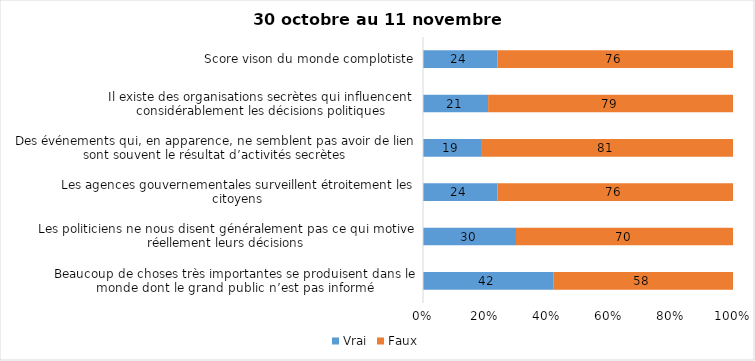
| Category | Vrai | Faux |
|---|---|---|
| Beaucoup de choses très importantes se produisent dans le monde dont le grand public n’est pas informé | 42 | 58 |
| Les politiciens ne nous disent généralement pas ce qui motive réellement leurs décisions | 30 | 70 |
| Les agences gouvernementales surveillent étroitement les citoyens | 24 | 76 |
| Des événements qui, en apparence, ne semblent pas avoir de lien sont souvent le résultat d’activités secrètes | 19 | 81 |
| Il existe des organisations secrètes qui influencent considérablement les décisions politiques | 21 | 79 |
| Score vison du monde complotiste | 24 | 76 |